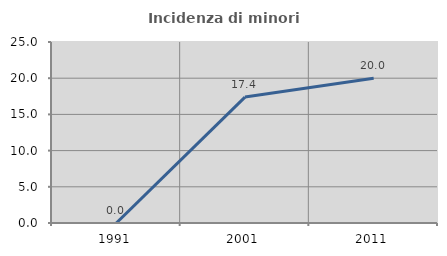
| Category | Incidenza di minori stranieri |
|---|---|
| 1991.0 | 0 |
| 2001.0 | 17.391 |
| 2011.0 | 20 |